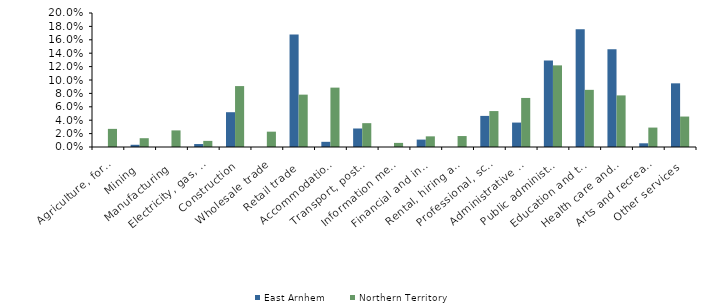
| Category | East Arnhem | Northern Territory |
|---|---|---|
| Agriculture, forestry and fishing | 0 | 0.027 |
| Mining | 0.003 | 0.013 |
| Manufacturing | 0 | 0.025 |
| Electricity, gas, water and waste services | 0.004 | 0.009 |
| Construction | 0.052 | 0.091 |
| Wholesale trade | 0 | 0.023 |
| Retail trade | 0.168 | 0.078 |
| Accommodation and food services | 0.008 | 0.089 |
| Transport, postal and warehousing | 0.028 | 0.036 |
| Information media and telecommunications | 0 | 0.006 |
| Financial and insurance services | 0.011 | 0.016 |
| Rental, hiring and real estate services | 0 | 0.016 |
| Professional, scientific and technical services | 0.046 | 0.054 |
| Administrative and support services | 0.036 | 0.073 |
| Public administration and safety | 0.129 | 0.122 |
| Education and training | 0.176 | 0.085 |
| Health care and social assistance | 0.146 | 0.077 |
| Arts and recreation services | 0.006 | 0.029 |
| Other services | 0.095 | 0.045 |